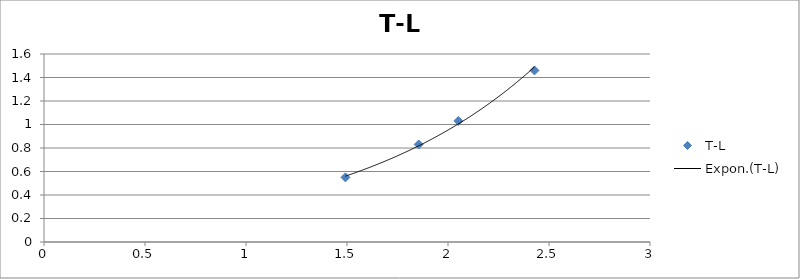
| Category | T-L |
|---|---|
| 1.492 | 0.55 |
| 1.855 | 0.83 |
| 2.051 | 1.03 |
| 2.428 | 1.46 |